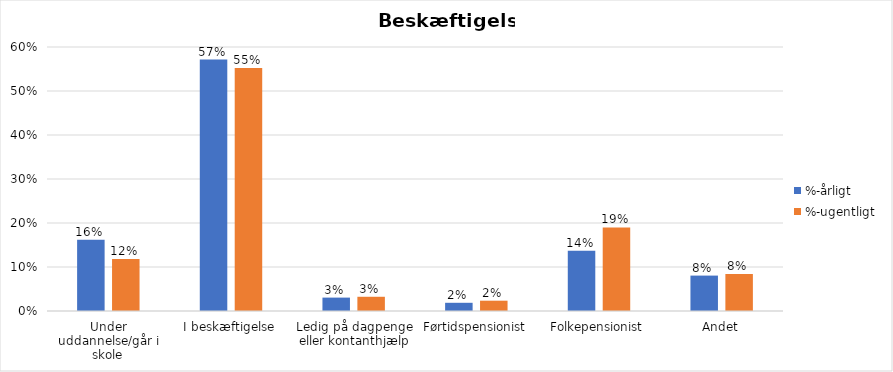
| Category | %-årligt | %-ugentligt |
|---|---|---|
| Under uddannelse/går i skole | 0.162 | 0.118 |
| I beskæftigelse | 0.571 | 0.552 |
| Ledig på dagpenge eller kontanthjælp | 0.03 | 0.032 |
| Førtidspensionist | 0.019 | 0.023 |
| Folkepensionist | 0.137 | 0.19 |
| Andet | 0.08 | 0.084 |